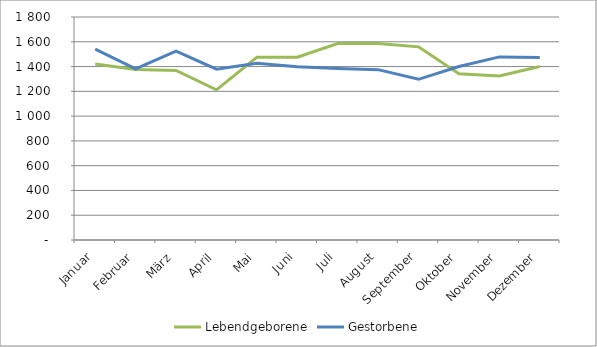
| Category | Lebendgeborene | Gestorbene |
|---|---|---|
| Januar | 1420 | 1541 |
| Februar | 1376 | 1382 |
| März | 1369 | 1525 |
| April | 1212 | 1379 |
| Mai | 1475 | 1426 |
| Juni | 1476 | 1399 |
| Juli | 1586 | 1384 |
| August | 1586 | 1375 |
| September | 1559 | 1297 |
| Oktober | 1342 | 1400 |
| November | 1324 | 1478 |
| Dezember | 1400 | 1474 |